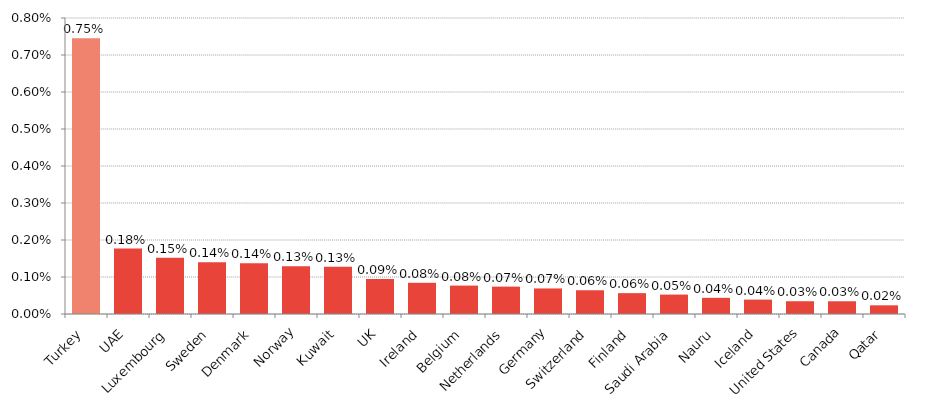
| Category | 2016 |
|---|---|
| Turkey | 0.007 |
| UAE | 0.002 |
| Luxembourg | 0.002 |
| Sweden | 0.001 |
| Denmark | 0.001 |
| Norway | 0.001 |
| Kuwait | 0.001 |
| UK | 0.001 |
| Ireland | 0.001 |
| Belgium | 0.001 |
| Netherlands | 0.001 |
| Germany | 0.001 |
| Switzerland | 0.001 |
| Finland | 0.001 |
| Saudi Arabia | 0.001 |
| Nauru | 0 |
| Iceland | 0 |
| United States | 0 |
| Canada | 0 |
| Qatar | 0 |